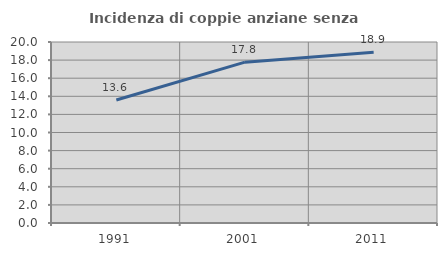
| Category | Incidenza di coppie anziane senza figli  |
|---|---|
| 1991.0 | 13.593 |
| 2001.0 | 17.775 |
| 2011.0 | 18.867 |